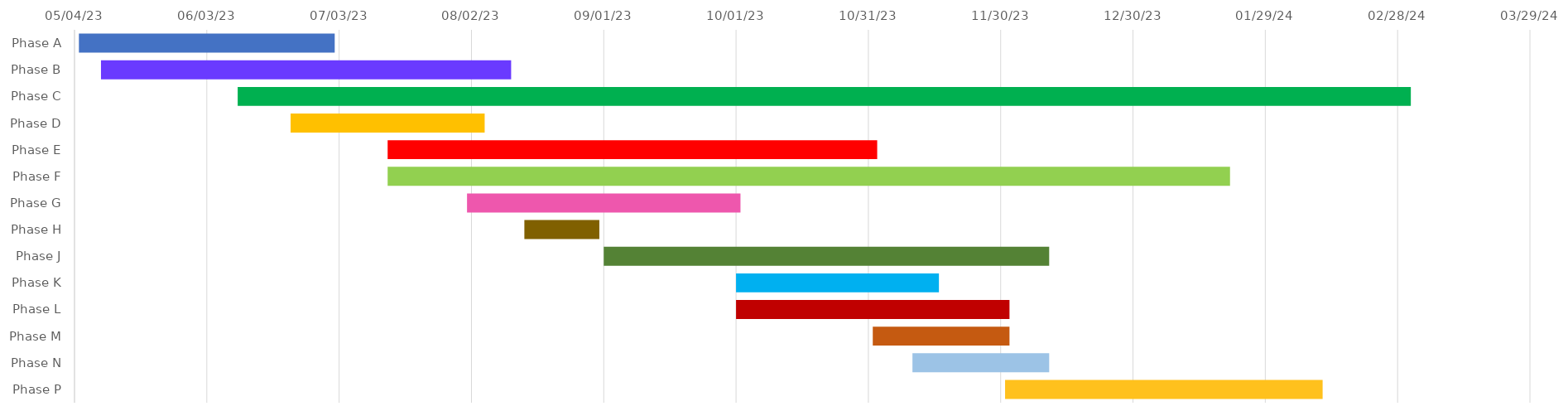
| Category | START 
DATE | Duration |
|---|---|---|
| Phase A | 2023-05-05 | 58 |
| Phase B | 2023-05-10 | 93 |
| Phase C | 2023-06-10 | 266 |
| Phase D | 2023-06-22 | 44 |
| Phase E | 2023-07-14 | 111 |
| Phase F | 2023-07-14 | 191 |
| Phase G | 2023-08-01 | 62 |
| Phase H | 2023-08-14 | 17 |
| Phase J | 2023-09-01 | 101 |
| Phase K | 2023-10-01 | 46 |
| Phase L | 2023-10-01 | 62 |
| Phase M | 2023-11-01 | 31 |
| Phase N | 2023-11-10 | 31 |
| Phase P | 2023-12-01 | 72 |